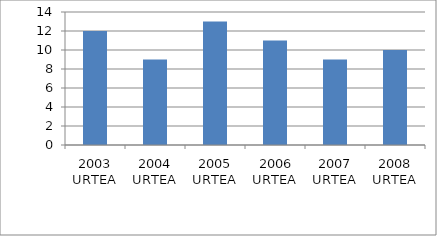
| Category | Series 0 |
|---|---|
| 2003 URTEA | 12 |
| 2004 URTEA | 9 |
| 2005 URTEA | 13 |
|  2006 URTEA | 11 |
| 2007 URTEA | 9 |
| 2008 URTEA | 10 |